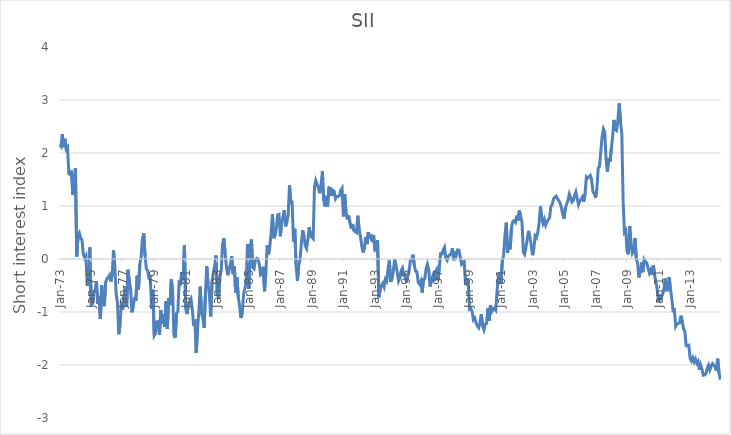
| Category | SII |
|---|---|
| 1973-01-01 | 2.159 |
| 1973-02-01 | 2.125 |
| 1973-03-01 | 2.354 |
| 1973-04-01 | 2.109 |
| 1973-05-01 | 2.268 |
| 1973-06-01 | 2.075 |
| 1973-07-01 | 2.107 |
| 1973-08-01 | 1.612 |
| 1973-09-01 | 1.595 |
| 1973-10-01 | 1.669 |
| 1973-11-01 | 1.213 |
| 1973-12-01 | 1.497 |
| 1974-01-01 | 1.716 |
| 1974-02-01 | 0.048 |
| 1974-03-01 | 0.437 |
| 1974-04-01 | 0.491 |
| 1974-05-01 | 0.393 |
| 1974-06-01 | 0.357 |
| 1974-07-01 | 0.094 |
| 1974-08-01 | 0.018 |
| 1974-09-01 | 0.06 |
| 1974-10-01 | -0.51 |
| 1974-11-01 | -0.291 |
| 1974-12-01 | 0.219 |
| 1975-01-01 | -0.864 |
| 1975-02-01 | -0.845 |
| 1975-03-01 | -0.622 |
| 1975-04-01 | -0.602 |
| 1975-05-01 | -0.42 |
| 1975-06-01 | -0.849 |
| 1975-07-01 | -0.701 |
| 1975-08-01 | -1.133 |
| 1975-09-01 | -0.498 |
| 1975-10-01 | -0.8 |
| 1975-11-01 | -0.89 |
| 1975-12-01 | -0.439 |
| 1976-01-01 | -0.375 |
| 1976-02-01 | -0.341 |
| 1976-03-01 | -0.303 |
| 1976-04-01 | -0.425 |
| 1976-05-01 | -0.29 |
| 1976-06-01 | 0.161 |
| 1976-07-01 | -0.144 |
| 1976-08-01 | -0.651 |
| 1976-09-01 | -0.825 |
| 1976-10-01 | -1.421 |
| 1976-11-01 | -1.23 |
| 1976-12-01 | -0.804 |
| 1977-01-01 | -0.953 |
| 1977-02-01 | -0.675 |
| 1977-03-01 | -0.521 |
| 1977-04-01 | -0.904 |
| 1977-05-01 | -0.204 |
| 1977-06-01 | -0.416 |
| 1977-07-01 | -0.567 |
| 1977-08-01 | -1.006 |
| 1977-09-01 | -0.893 |
| 1977-10-01 | -0.722 |
| 1977-11-01 | -0.79 |
| 1977-12-01 | -0.317 |
| 1978-01-01 | -0.584 |
| 1978-02-01 | -0.103 |
| 1978-03-01 | 0.031 |
| 1978-04-01 | 0.377 |
| 1978-05-01 | 0.487 |
| 1978-06-01 | 0.06 |
| 1978-07-01 | -0.188 |
| 1978-08-01 | -0.221 |
| 1978-09-01 | -0.358 |
| 1978-10-01 | -0.35 |
| 1978-11-01 | -0.94 |
| 1978-12-01 | -0.581 |
| 1979-01-01 | -1.444 |
| 1979-02-01 | -1.403 |
| 1979-03-01 | -1.164 |
| 1979-04-01 | -1.233 |
| 1979-05-01 | -1.429 |
| 1979-06-01 | -0.964 |
| 1979-07-01 | -1.228 |
| 1979-08-01 | -1.039 |
| 1979-09-01 | -1.281 |
| 1979-10-01 | -0.799 |
| 1979-11-01 | -1.317 |
| 1979-12-01 | -0.735 |
| 1980-01-01 | -0.87 |
| 1980-02-01 | -0.379 |
| 1980-03-01 | -0.607 |
| 1980-04-01 | -1.432 |
| 1980-05-01 | -1.486 |
| 1980-06-01 | -1.025 |
| 1980-07-01 | -0.991 |
| 1980-08-01 | -0.404 |
| 1980-09-01 | -0.496 |
| 1980-10-01 | -0.246 |
| 1980-11-01 | -0.385 |
| 1980-12-01 | 0.257 |
| 1981-01-01 | -0.938 |
| 1981-02-01 | -1.039 |
| 1981-03-01 | -0.873 |
| 1981-04-01 | -0.809 |
| 1981-05-01 | -0.757 |
| 1981-06-01 | -0.946 |
| 1981-07-01 | -1.256 |
| 1981-08-01 | -1.135 |
| 1981-09-01 | -1.771 |
| 1981-10-01 | -1.303 |
| 1981-11-01 | -0.991 |
| 1981-12-01 | -0.521 |
| 1982-01-01 | -1.028 |
| 1982-02-01 | -1.114 |
| 1982-03-01 | -1.298 |
| 1982-04-01 | -0.64 |
| 1982-05-01 | -0.136 |
| 1982-06-01 | -0.481 |
| 1982-07-01 | -0.671 |
| 1982-08-01 | -1.084 |
| 1982-09-01 | -0.433 |
| 1982-10-01 | -0.263 |
| 1982-11-01 | -0.139 |
| 1982-12-01 | 0.066 |
| 1983-01-01 | -0.655 |
| 1983-02-01 | -0.744 |
| 1983-03-01 | -0.327 |
| 1983-04-01 | -0.224 |
| 1983-05-01 | 0.278 |
| 1983-06-01 | 0.389 |
| 1983-07-01 | 0.096 |
| 1983-08-01 | -0.152 |
| 1983-09-01 | -0.307 |
| 1983-10-01 | -0.195 |
| 1983-11-01 | -0.1 |
| 1983-12-01 | 0.05 |
| 1984-01-01 | -0.287 |
| 1984-02-01 | -0.141 |
| 1984-03-01 | -0.632 |
| 1984-04-01 | -0.346 |
| 1984-05-01 | -0.724 |
| 1984-06-01 | -0.887 |
| 1984-07-01 | -1.113 |
| 1984-08-01 | -1.024 |
| 1984-09-01 | -0.67 |
| 1984-10-01 | -0.56 |
| 1984-11-01 | -0.438 |
| 1984-12-01 | 0.283 |
| 1985-01-01 | -0.562 |
| 1985-02-01 | 0.223 |
| 1985-03-01 | 0.369 |
| 1985-04-01 | -0.158 |
| 1985-05-01 | -0.184 |
| 1985-06-01 | -0.025 |
| 1985-07-01 | 0.012 |
| 1985-08-01 | 0.002 |
| 1985-09-01 | -0.098 |
| 1985-10-01 | -0.297 |
| 1985-11-01 | -0.271 |
| 1985-12-01 | -0.147 |
| 1986-01-01 | -0.608 |
| 1986-02-01 | -0.242 |
| 1986-03-01 | 0.26 |
| 1986-04-01 | 0.088 |
| 1986-05-01 | 0.24 |
| 1986-06-01 | 0.495 |
| 1986-07-01 | 0.843 |
| 1986-08-01 | 0.393 |
| 1986-09-01 | 0.447 |
| 1986-10-01 | 0.585 |
| 1986-11-01 | 0.833 |
| 1986-12-01 | 0.841 |
| 1987-01-01 | 0.43 |
| 1987-02-01 | 0.687 |
| 1987-03-01 | 0.786 |
| 1987-04-01 | 0.92 |
| 1987-05-01 | 0.617 |
| 1987-06-01 | 0.702 |
| 1987-07-01 | 0.836 |
| 1987-08-01 | 1.396 |
| 1987-09-01 | 1.063 |
| 1987-10-01 | 1.07 |
| 1987-11-01 | 0.328 |
| 1987-12-01 | 0.571 |
| 1988-01-01 | -0.117 |
| 1988-02-01 | -0.414 |
| 1988-03-01 | -0.119 |
| 1988-04-01 | -0.016 |
| 1988-05-01 | 0.299 |
| 1988-06-01 | 0.539 |
| 1988-07-01 | 0.436 |
| 1988-08-01 | 0.25 |
| 1988-09-01 | 0.199 |
| 1988-10-01 | 0.372 |
| 1988-11-01 | 0.596 |
| 1988-12-01 | 0.445 |
| 1989-01-01 | 0.412 |
| 1989-02-01 | 0.384 |
| 1989-03-01 | 1.358 |
| 1989-04-01 | 1.483 |
| 1989-05-01 | 1.411 |
| 1989-06-01 | 1.347 |
| 1989-07-01 | 1.241 |
| 1989-08-01 | 1.393 |
| 1989-09-01 | 1.654 |
| 1989-10-01 | 1.112 |
| 1989-11-01 | 0.991 |
| 1989-12-01 | 1.191 |
| 1990-01-01 | 0.994 |
| 1990-02-01 | 1.345 |
| 1990-03-01 | 1.334 |
| 1990-04-01 | 1.19 |
| 1990-05-01 | 1.297 |
| 1990-06-01 | 1.273 |
| 1990-07-01 | 1.136 |
| 1990-08-01 | 1.179 |
| 1990-09-01 | 1.181 |
| 1990-10-01 | 1.194 |
| 1990-11-01 | 1.296 |
| 1990-12-01 | 1.336 |
| 1991-01-01 | 0.803 |
| 1991-02-01 | 1.223 |
| 1991-03-01 | 0.893 |
| 1991-04-01 | 0.747 |
| 1991-05-01 | 0.824 |
| 1991-06-01 | 0.692 |
| 1991-07-01 | 0.573 |
| 1991-08-01 | 0.661 |
| 1991-09-01 | 0.537 |
| 1991-10-01 | 0.513 |
| 1991-11-01 | 0.496 |
| 1991-12-01 | 0.816 |
| 1992-01-01 | 0.551 |
| 1992-02-01 | 0.428 |
| 1992-03-01 | 0.242 |
| 1992-04-01 | 0.124 |
| 1992-05-01 | 0.211 |
| 1992-06-01 | 0.414 |
| 1992-07-01 | 0.281 |
| 1992-08-01 | 0.509 |
| 1992-09-01 | 0.387 |
| 1992-10-01 | 0.463 |
| 1992-11-01 | 0.328 |
| 1992-12-01 | 0.45 |
| 1993-01-01 | 0.171 |
| 1993-02-01 | 0.191 |
| 1993-03-01 | 0.357 |
| 1993-04-01 | -0.723 |
| 1993-05-01 | -0.586 |
| 1993-06-01 | -0.495 |
| 1993-07-01 | -0.459 |
| 1993-08-01 | -0.526 |
| 1993-09-01 | -0.382 |
| 1993-10-01 | -0.419 |
| 1993-11-01 | -0.185 |
| 1993-12-01 | -0.029 |
| 1994-01-01 | -0.431 |
| 1994-02-01 | -0.373 |
| 1994-03-01 | -0.242 |
| 1994-04-01 | -0.004 |
| 1994-05-01 | -0.111 |
| 1994-06-01 | -0.25 |
| 1994-07-01 | -0.416 |
| 1994-08-01 | -0.359 |
| 1994-09-01 | -0.219 |
| 1994-10-01 | -0.172 |
| 1994-11-01 | -0.304 |
| 1994-12-01 | -0.295 |
| 1995-01-01 | -0.446 |
| 1995-02-01 | -0.298 |
| 1995-03-01 | -0.238 |
| 1995-04-01 | -0.028 |
| 1995-05-01 | -0.011 |
| 1995-06-01 | 0.08 |
| 1995-07-01 | -0.12 |
| 1995-08-01 | -0.232 |
| 1995-09-01 | -0.241 |
| 1995-10-01 | -0.441 |
| 1995-11-01 | -0.476 |
| 1995-12-01 | -0.419 |
| 1996-01-01 | -0.637 |
| 1996-02-01 | -0.381 |
| 1996-03-01 | -0.368 |
| 1996-04-01 | -0.179 |
| 1996-05-01 | -0.097 |
| 1996-06-01 | -0.197 |
| 1996-07-01 | -0.519 |
| 1996-08-01 | -0.404 |
| 1996-09-01 | -0.332 |
| 1996-10-01 | -0.418 |
| 1996-11-01 | -0.252 |
| 1996-12-01 | -0.202 |
| 1997-01-01 | -0.402 |
| 1997-02-01 | -0.176 |
| 1997-03-01 | 0.099 |
| 1997-04-01 | 0.096 |
| 1997-05-01 | 0.168 |
| 1997-06-01 | 0.22 |
| 1997-07-01 | 0.009 |
| 1997-08-01 | -0.026 |
| 1997-09-01 | 0.056 |
| 1997-10-01 | 0.079 |
| 1997-11-01 | 0.096 |
| 1997-12-01 | 0.205 |
| 1998-01-01 | -0.024 |
| 1998-02-01 | 0.14 |
| 1998-03-01 | 0.076 |
| 1998-04-01 | 0.172 |
| 1998-05-01 | 0.166 |
| 1998-06-01 | 0.033 |
| 1998-07-01 | -0.097 |
| 1998-08-01 | -0.064 |
| 1998-09-01 | -0.047 |
| 1998-10-01 | -0.495 |
| 1998-11-01 | -0.393 |
| 1998-12-01 | -0.418 |
| 1999-01-01 | -0.945 |
| 1999-02-01 | -0.932 |
| 1999-03-01 | -0.993 |
| 1999-04-01 | -1.145 |
| 1999-05-01 | -1.113 |
| 1999-06-01 | -1.203 |
| 1999-07-01 | -1.264 |
| 1999-08-01 | -1.297 |
| 1999-09-01 | -1.205 |
| 1999-10-01 | -1.042 |
| 1999-11-01 | -1.263 |
| 1999-12-01 | -1.336 |
| 2000-01-01 | -1.227 |
| 2000-02-01 | -1.217 |
| 2000-03-01 | -0.934 |
| 2000-04-01 | -1.17 |
| 2000-05-01 | -0.868 |
| 2000-06-01 | -0.996 |
| 2000-07-01 | -0.96 |
| 2000-08-01 | -0.925 |
| 2000-09-01 | -0.962 |
| 2000-10-01 | -0.606 |
| 2000-11-01 | -0.323 |
| 2000-12-01 | -0.246 |
| 2001-01-01 | -0.47 |
| 2001-02-01 | -0.046 |
| 2001-03-01 | 0.072 |
| 2001-04-01 | 0.436 |
| 2001-05-01 | 0.686 |
| 2001-06-01 | 0.119 |
| 2001-07-01 | 0.305 |
| 2001-08-01 | 0.183 |
| 2001-09-01 | 0.601 |
| 2001-10-01 | 0.708 |
| 2001-11-01 | 0.723 |
| 2001-12-01 | 0.69 |
| 2002-01-01 | 0.818 |
| 2002-02-01 | 0.725 |
| 2002-03-01 | 0.915 |
| 2002-04-01 | 0.806 |
| 2002-05-01 | 0.691 |
| 2002-06-01 | 0.133 |
| 2002-07-01 | 0.09 |
| 2002-08-01 | 0.221 |
| 2002-09-01 | 0.371 |
| 2002-10-01 | 0.531 |
| 2002-11-01 | 0.399 |
| 2002-12-01 | 0.265 |
| 2003-01-01 | 0.072 |
| 2003-02-01 | 0.195 |
| 2003-03-01 | 0.436 |
| 2003-04-01 | 0.403 |
| 2003-05-01 | 0.495 |
| 2003-06-01 | 0.672 |
| 2003-07-01 | 0.995 |
| 2003-08-01 | 0.791 |
| 2003-09-01 | 0.675 |
| 2003-10-01 | 0.746 |
| 2003-11-01 | 0.637 |
| 2003-12-01 | 0.695 |
| 2004-01-01 | 0.745 |
| 2004-02-01 | 0.778 |
| 2004-03-01 | 0.988 |
| 2004-04-01 | 1.031 |
| 2004-05-01 | 1.135 |
| 2004-06-01 | 1.166 |
| 2004-07-01 | 1.185 |
| 2004-08-01 | 1.14 |
| 2004-09-01 | 1.1 |
| 2004-10-01 | 1.057 |
| 2004-11-01 | 0.97 |
| 2004-12-01 | 0.84 |
| 2005-01-01 | 0.763 |
| 2005-02-01 | 0.957 |
| 2005-03-01 | 1.039 |
| 2005-04-01 | 1.106 |
| 2005-05-01 | 1.227 |
| 2005-06-01 | 1.159 |
| 2005-07-01 | 1.074 |
| 2005-08-01 | 1.101 |
| 2005-09-01 | 1.195 |
| 2005-10-01 | 1.264 |
| 2005-11-01 | 1.145 |
| 2005-12-01 | 1.024 |
| 2006-01-01 | 1.091 |
| 2006-02-01 | 1.125 |
| 2006-03-01 | 1.171 |
| 2006-04-01 | 1.081 |
| 2006-05-01 | 1.227 |
| 2006-06-01 | 1.548 |
| 2006-07-01 | 1.526 |
| 2006-08-01 | 1.554 |
| 2006-09-01 | 1.576 |
| 2006-10-01 | 1.497 |
| 2006-11-01 | 1.268 |
| 2006-12-01 | 1.24 |
| 2007-01-01 | 1.157 |
| 2007-02-01 | 1.319 |
| 2007-03-01 | 1.713 |
| 2007-04-01 | 1.745 |
| 2007-05-01 | 2.035 |
| 2007-06-01 | 2.315 |
| 2007-07-01 | 2.453 |
| 2007-08-01 | 2.396 |
| 2007-09-01 | 1.88 |
| 2007-10-01 | 1.645 |
| 2007-11-01 | 1.904 |
| 2007-12-01 | 1.837 |
| 2008-01-01 | 2.077 |
| 2008-02-01 | 2.314 |
| 2008-03-01 | 2.624 |
| 2008-04-01 | 2.439 |
| 2008-05-01 | 2.423 |
| 2008-06-01 | 2.613 |
| 2008-07-01 | 2.936 |
| 2008-08-01 | 2.587 |
| 2008-09-01 | 2.356 |
| 2008-10-01 | 1.075 |
| 2008-11-01 | 0.506 |
| 2008-12-01 | 0.54 |
| 2009-01-01 | 0.141 |
| 2009-02-01 | 0.089 |
| 2009-03-01 | 0.618 |
| 2009-04-01 | 0.263 |
| 2009-05-01 | 0.105 |
| 2009-06-01 | 0.149 |
| 2009-07-01 | 0.397 |
| 2009-08-01 | 0.006 |
| 2009-09-01 | -0.082 |
| 2009-10-01 | -0.348 |
| 2009-11-01 | -0.228 |
| 2009-12-01 | -0.066 |
| 2010-01-01 | -0.249 |
| 2010-02-01 | -0.007 |
| 2010-03-01 | -0.046 |
| 2010-04-01 | -0.076 |
| 2010-05-01 | -0.176 |
| 2010-06-01 | -0.266 |
| 2010-07-01 | -0.206 |
| 2010-08-01 | -0.299 |
| 2010-09-01 | -0.122 |
| 2010-10-01 | -0.302 |
| 2010-11-01 | -0.455 |
| 2010-12-01 | -0.58 |
| 2011-01-01 | -0.817 |
| 2011-02-01 | -0.712 |
| 2011-03-01 | -0.739 |
| 2011-04-01 | -0.667 |
| 2011-05-01 | -0.58 |
| 2011-06-01 | -0.365 |
| 2011-07-01 | -0.585 |
| 2011-08-01 | -0.586 |
| 2011-09-01 | -0.342 |
| 2011-10-01 | -0.561 |
| 2011-11-01 | -0.738 |
| 2011-12-01 | -0.972 |
| 2012-01-01 | -0.958 |
| 2012-02-01 | -1.271 |
| 2012-03-01 | -1.223 |
| 2012-04-01 | -1.217 |
| 2012-05-01 | -1.203 |
| 2012-06-01 | -1.069 |
| 2012-07-01 | -1.181 |
| 2012-08-01 | -1.318 |
| 2012-09-01 | -1.373 |
| 2012-10-01 | -1.636 |
| 2012-11-01 | -1.636 |
| 2012-12-01 | -1.627 |
| 2013-01-01 | -1.875 |
| 2013-02-01 | -1.923 |
| 2013-03-01 | -1.863 |
| 2013-04-01 | -1.94 |
| 2013-05-01 | -1.885 |
| 2013-06-01 | -1.966 |
| 2013-07-01 | -1.93 |
| 2013-08-01 | -2.09 |
| 2013-09-01 | -1.998 |
| 2013-10-01 | -2.081 |
| 2013-11-01 | -2.193 |
| 2013-12-01 | -2.19 |
| 2014-01-01 | -2.167 |
| 2014-02-01 | -2.064 |
| 2014-03-01 | -2.004 |
| 2014-04-01 | -2.092 |
| 2014-05-01 | -2.025 |
| 2014-06-01 | -1.975 |
| 2014-07-01 | -2.007 |
| 2014-08-01 | -2.032 |
| 2014-09-01 | -2.109 |
| 2014-10-01 | -1.882 |
| 2014-11-01 | -2.154 |
| 2014-12-01 | -2.276 |